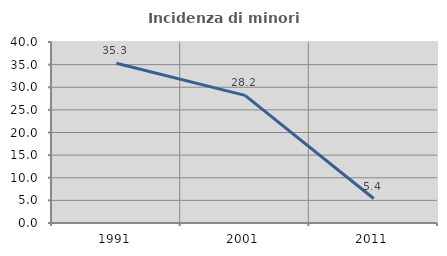
| Category | Incidenza di minori stranieri |
|---|---|
| 1991.0 | 35.294 |
| 2001.0 | 28.205 |
| 2011.0 | 5.405 |